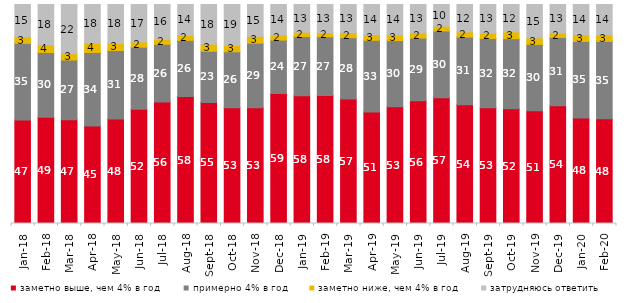
| Category | заметно выше, чем 4% в год | примерно 4% в год | заметно ниже, чем 4% в год | затрудняюсь ответить |
|---|---|---|---|---|
| 2018-01-01 | 47.25 | 35 | 3 | 14.75 |
| 2018-02-01 | 48.5 | 29.6 | 3.5 | 18.4 |
| 2018-03-01 | 47.4 | 27.25 | 2.9 | 22.45 |
| 2018-04-01 | 44.55 | 33.55 | 4.3 | 17.6 |
| 2018-05-01 | 47.7 | 31.3 | 3.25 | 17.75 |
| 2018-06-01 | 52.2 | 28.3 | 2.4 | 17.1 |
| 2018-07-01 | 55.5 | 26.35 | 2.25 | 15.9 |
| 2018-08-01 | 57.95 | 25.65 | 2.3 | 14.1 |
| 2018-09-01 | 55.3 | 23.35 | 3.25 | 18.1 |
| 2018-10-01 | 52.85 | 25.55 | 2.95 | 18.65 |
| 2018-11-01 | 52.844 | 29.491 | 3.144 | 14.521 |
| 2018-12-01 | 59.4 | 24.35 | 2.35 | 13.9 |
| 2019-01-01 | 58.3 | 27.05 | 2 | 12.65 |
| 2019-02-01 | 58.45 | 26.8 | 1.85 | 12.9 |
| 2019-03-01 | 56.887 | 27.946 | 2.387 | 12.78 |
| 2019-04-01 | 50.891 | 32.772 | 2.574 | 13.762 |
| 2019-05-01 | 53.343 | 30.163 | 2.526 | 13.967 |
| 2019-06-01 | 56.06 | 28.579 | 2.444 | 12.918 |
| 2019-07-01 | 57.475 | 30.396 | 2.228 | 9.901 |
| 2019-08-01 | 54.246 | 30.869 | 2.398 | 12.488 |
| 2019-09-01 | 52.822 | 31.634 | 2.475 | 13.069 |
| 2019-10-01 | 52.426 | 31.98 | 3.119 | 12.475 |
| 2019-11-01 | 51.485 | 30.297 | 2.921 | 15.297 |
| 2019-12-01 | 53.713 | 31.238 | 2.079 | 12.97 |
| 2020-01-01 | 48.119 | 35 | 3.02 | 13.861 |
| 2020-02-01 | 47.822 | 35.347 | 2.97 | 13.861 |